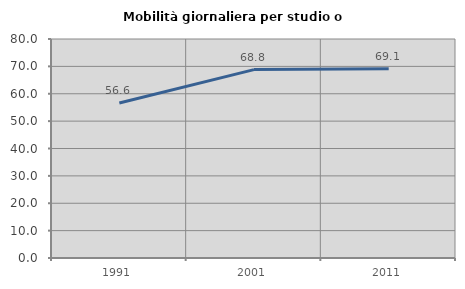
| Category | Mobilità giornaliera per studio o lavoro |
|---|---|
| 1991.0 | 56.64 |
| 2001.0 | 68.823 |
| 2011.0 | 69.146 |